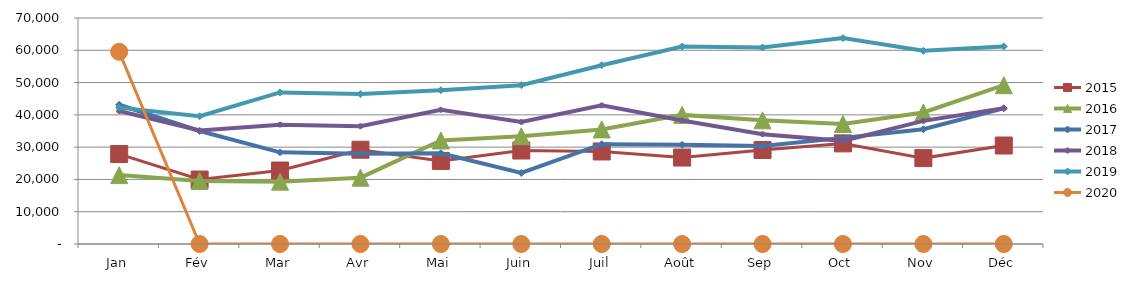
| Category | 2015 | 2016 | 2017 | 2018 | 2019 | 2020 |
|---|---|---|---|---|---|---|
| Jan | 27858.045 | 21335.134 | 43138.429 | 41189.736 | 42238.432 | 59529.375 |
| Fév | 19964.197 | 19532.337 | 35009.004 | 35137.047 | 39568.195 | 0 |
| Mar | 22759.766 | 19313.57 | 28389.673 | 36966.816 | 46942.202 | 0 |
| Avr | 29201.77 | 20550.618 | 27972.802 | 36485.223 | 46427.766 | 0 |
| Mai | 25732.092 | 32066.609 | 28116.194 | 41558.724 | 47634.031 | 0 |
| Juin | 28955.174 | 33383.309 | 22002.869 | 37797.134 | 49186.221 | 0 |
| Juil | 28656.613 | 35495.63 | 30926.131 | 42927.847 | 55367.883 | 0 |
| Août | 26781.044 | 39992.765 | 30717.708 | 38263.165 | 61146.365 | 0 |
| Sep | 29100.698 | 38306.611 | 30378.863 | 34011.672 | 60874.85 | 0 |
| Oct | 31157.855 | 37188.976 | 32868.78 | 31946.792 | 63789.634 | 0 |
| Nov | 26604.964 | 40729.636 | 35537.079 | 38139.513 | 59829.208 | 0 |
| Déc | 30502.489 | 49180.232 | 42040.249 | 42064.579 | 61190.831 | 0 |